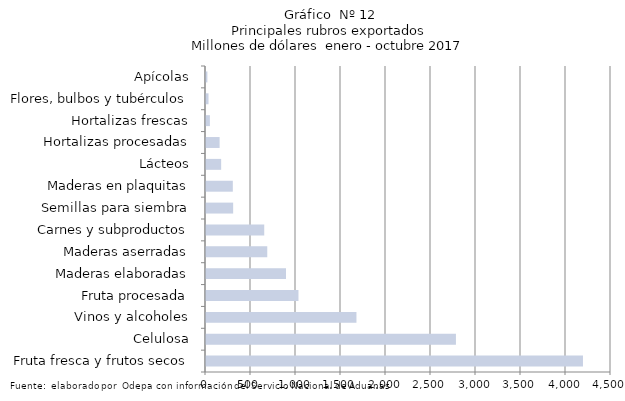
| Category | Series 7 |
|---|---|
| Fruta fresca y frutos secos | 4188528.561 |
| Celulosa | 2777055.995 |
| Vinos y alcoholes | 1671696.654 |
| Fruta procesada | 1027300.999 |
| Maderas elaboradas | 888857.517 |
| Maderas aserradas | 680664.333 |
| Carnes y subproductos | 647030.252 |
| Semillas para siembra | 301699.065 |
| Maderas en plaquitas | 298032.772 |
| Lácteos | 168354.868 |
| Hortalizas procesadas | 151191.888 |
| Hortalizas frescas | 43128.161 |
| Flores, bulbos y tubérculos | 27911.039 |
| Apícolas | 15463.103 |